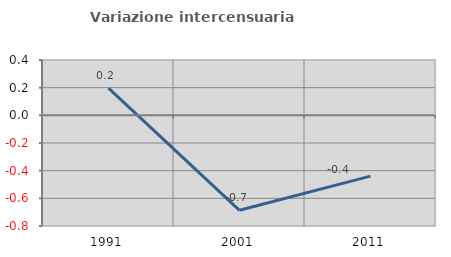
| Category | Variazione intercensuaria annua |
|---|---|
| 1991.0 | 0.197 |
| 2001.0 | -0.687 |
| 2011.0 | -0.439 |